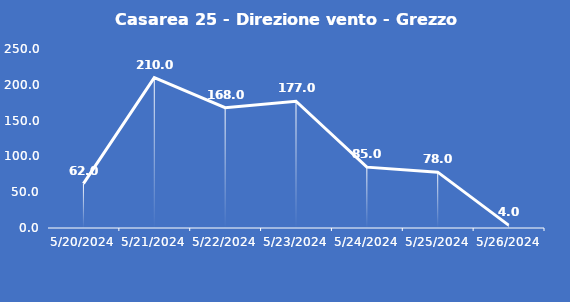
| Category | Casarea 25 - Direzione vento - Grezzo (°N) |
|---|---|
| 5/20/24 | 62 |
| 5/21/24 | 210 |
| 5/22/24 | 168 |
| 5/23/24 | 177 |
| 5/24/24 | 85 |
| 5/25/24 | 78 |
| 5/26/24 | 4 |